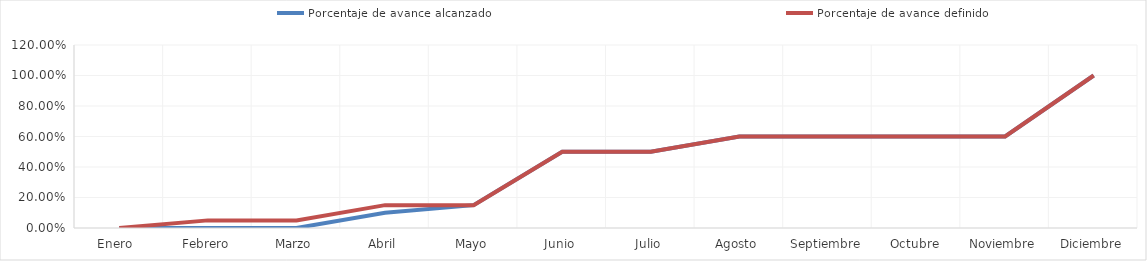
| Category | Porcentaje de avance alcanzado | Porcentaje de avance definido |
|---|---|---|
| Enero  | 0 | 0 |
| Febrero | 0 | 0.05 |
| Marzo | 0 | 0.05 |
| Abril | 0.1 | 0.15 |
| Mayo | 0.15 | 0.15 |
| Junio | 0.5 | 0.5 |
| Julio | 0.5 | 0.5 |
| Agosto | 0.6 | 0.6 |
| Septiembre | 0.6 | 0.6 |
| Octubre | 0.6 | 0.6 |
| Noviembre | 0.6 | 0.6 |
| Diciembre | 1 | 1 |